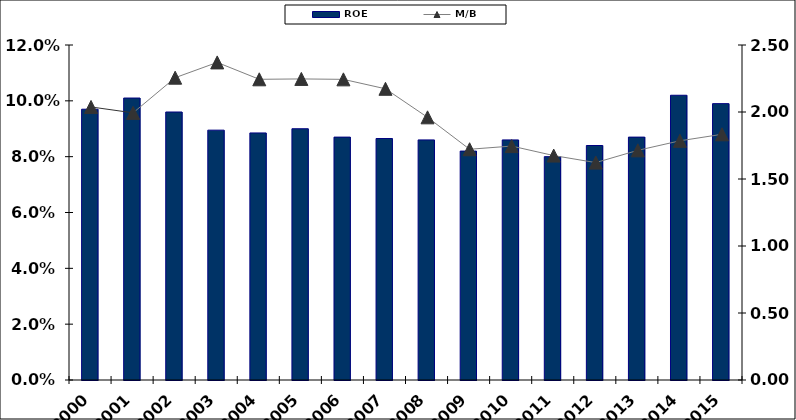
| Category | ROE |
|---|---|
| 2000.0 | 0.097 |
| 2001.0 | 0.101 |
| 2002.0 | 0.096 |
| 2003.0 | 0.09 |
| 2004.0 | 0.088 |
| 2005.0 | 0.09 |
| 2006.0 | 0.087 |
| 2007.0 | 0.086 |
| 2008.0 | 0.086 |
| 2009.0 | 0.082 |
| 2010.0 | 0.086 |
| 2011.0 | 0.08 |
| 2012.0 | 0.084 |
| 2013.0 | 0.087 |
| 2014.0 | 0.102 |
| 2015.0 | 0.099 |